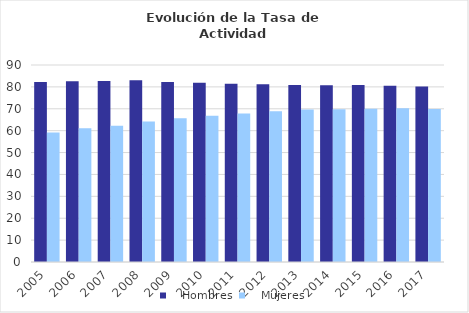
| Category |    Hombres |    Mujeres |
|---|---|---|
| 2005.0 | 82.21 | 59.14 |
| 2006.0 | 82.52 | 61.05 |
| 2007.0 | 82.68 | 62.29 |
| 2008.0 | 83 | 64.14 |
| 2009.0 | 82.2 | 65.69 |
| 2010.0 | 81.86 | 66.78 |
| 2011.0 | 81.49 | 67.89 |
| 2012.0 | 81.25 | 68.83 |
| 2013.0 | 80.9 | 69.67 |
| 2014.0 | 80.72 | 69.77 |
| 2015.0 | 80.859 | 70.017 |
| 2016.0 | 80.501 | 70.201 |
| 2017.0 | 80.229 | 69.897 |